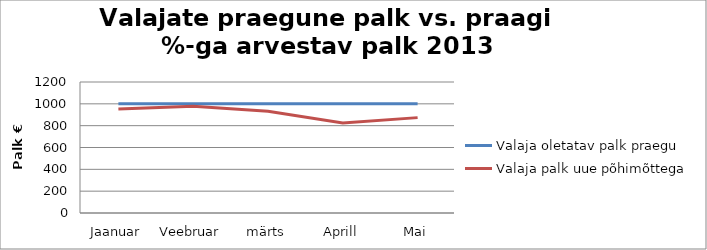
| Category | Valaja oletatav palk praegu | Valaja palk uue põhimõttega |
|---|---|---|
| Jaanuar | 1000 | 953.648 |
| Veebruar | 1000 | 977.621 |
| märts | 1000 | 932.162 |
| Aprill | 1000 | 823.767 |
| Mai | 1000 | 873.669 |